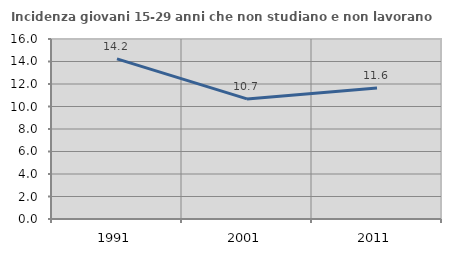
| Category | Incidenza giovani 15-29 anni che non studiano e non lavorano  |
|---|---|
| 1991.0 | 14.232 |
| 2001.0 | 10.675 |
| 2011.0 | 11.64 |